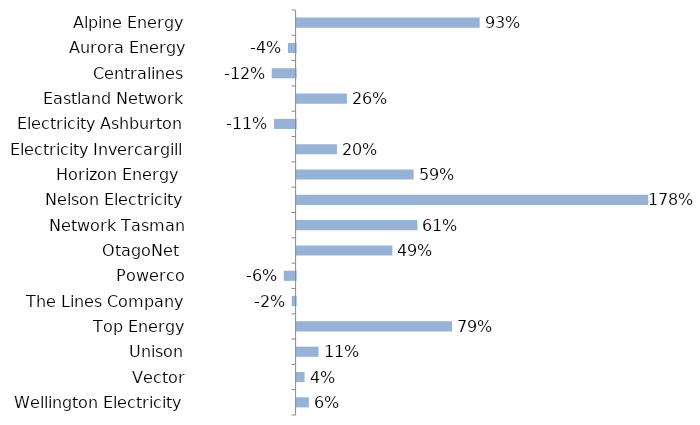
| Category | Series 0 |
|---|---|
| Alpine Energy | 0.928 |
| Aurora Energy | -0.039 |
| Centralines | -0.121 |
| Eastland Network | 0.255 |
| Electricity Ashburton | -0.11 |
| Electricity Invercargill | 0.205 |
| Horizon Energy  | 0.593 |
| Nelson Electricity | 1.783 |
| Network Tasman | 0.613 |
| OtagoNet  | 0.486 |
| Powerco | -0.06 |
| The Lines Company | -0.02 |
| Top Energy | 0.788 |
| Unison | 0.111 |
| Vector | 0.04 |
| Wellington Electricity | 0.062 |